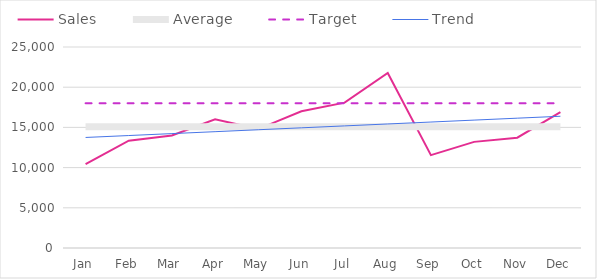
| Category | Sales | Average | Target | Trend |
|---|---|---|---|---|
| Jan | 10437 | 15067.495 | 18000 | 13748.567 |
| Feb | 13347.27 | 15067.495 | 18000 | 13988.372 |
| Mar | 14001.95 | 15067.495 | 18000 | 14228.177 |
| Apr | 16006.18 | 15067.495 | 18000 | 14467.982 |
| May | 14793.66 | 15067.495 | 18000 | 14707.787 |
| Jun | 17000.44 | 15067.495 | 18000 | 14947.592 |
| Jul | 18076.85 | 15067.495 | 18000 | 15187.398 |
| Aug | 21775.21 | 15067.495 | 18000 | 15427.203 |
| Sep | 11548.56 | 15067.495 | 18000 | 15667.008 |
| Oct | 13201 | 15067.495 | 18000 | 15906.813 |
| Nov | 13724.82 | 15067.495 | 18000 | 16146.618 |
| Dec | 16897 | 15067.495 | 18000 | 16386.423 |